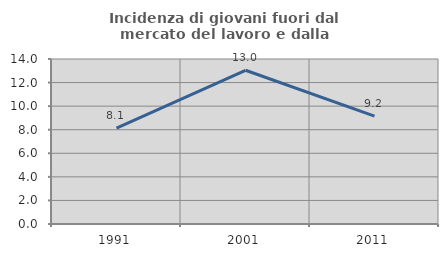
| Category | Incidenza di giovani fuori dal mercato del lavoro e dalla formazione  |
|---|---|
| 1991.0 | 8.13 |
| 2001.0 | 13.043 |
| 2011.0 | 9.16 |